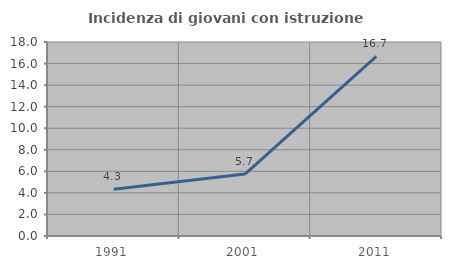
| Category | Incidenza di giovani con istruzione universitaria |
|---|---|
| 1991.0 | 4.348 |
| 2001.0 | 5.747 |
| 2011.0 | 16.667 |